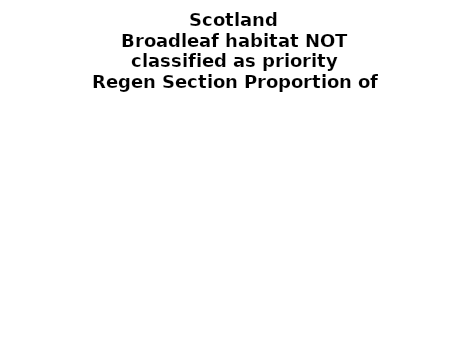
| Category | Broadleaf habitat NOT classified as priority |
|---|---|
| None | 0.169 |
| Seedlings only | 0.002 |
| Seedlings, saplings only | 0.04 |
| Seedlings, saplings, <7 cm trees | 0.11 |
| Saplings only | 0.291 |
| <7 cm trees, seedlings only | 0 |
| <7 cm trees, saplings only | 0.277 |
| <7 cm Trees only | 0.111 |